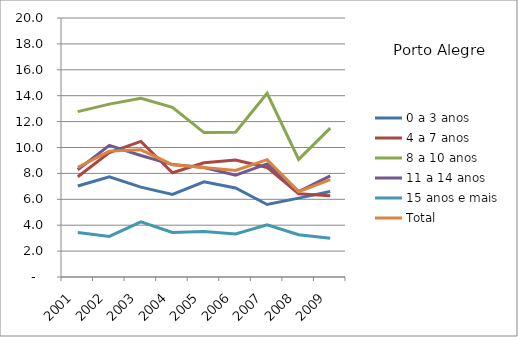
| Category | 0 a 3 anos | 4 a 7 anos | 8 a 10 anos | 11 a 14 anos | 15 anos e mais | Total |
|---|---|---|---|---|---|---|
| 2001.0 | 7.03 | 7.74 | 12.77 | 8.28 | 3.44 | 8.46 |
| 2002.0 | 7.74 | 9.6 | 13.35 | 10.17 | 3.13 | 9.72 |
| 2003.0 | 6.94 | 10.47 | 13.8 | 9.38 | 4.26 | 9.82 |
| 2004.0 | 6.38 | 8.05 | 13.1 | 8.68 | 3.44 | 8.67 |
| 2005.0 | 7.35 | 8.82 | 11.15 | 8.46 | 3.51 | 8.46 |
| 2006.0 | 6.87 | 9.04 | 11.18 | 7.87 | 3.33 | 8.23 |
| 2007.0 | 5.6 | 8.46 | 14.19 | 8.73 | 4.03 | 9.06 |
| 2008.0 | 6.09 | 6.43 | 9.08 | 6.6 | 3.27 | 6.59 |
| 2009.0 | 6.6 | 6.28 | 11.5 | 7.81 | 2.99 | 7.52 |